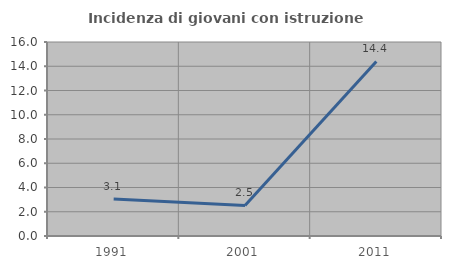
| Category | Incidenza di giovani con istruzione universitaria |
|---|---|
| 1991.0 | 3.053 |
| 2001.0 | 2.516 |
| 2011.0 | 14.4 |